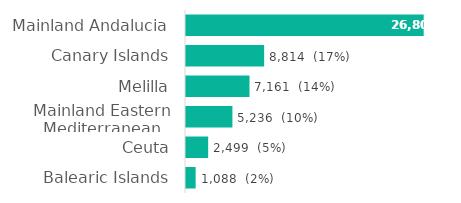
| Category | Series 0 |
|---|---|
| Mainland Andalucia | 26808 |
| Canary Islands | 8814 |
| Melilla | 7161 |
| Mainland Eastern Mediterranean | 5236 |
| Ceuta | 2499 |
| Balearic Islands | 1088 |